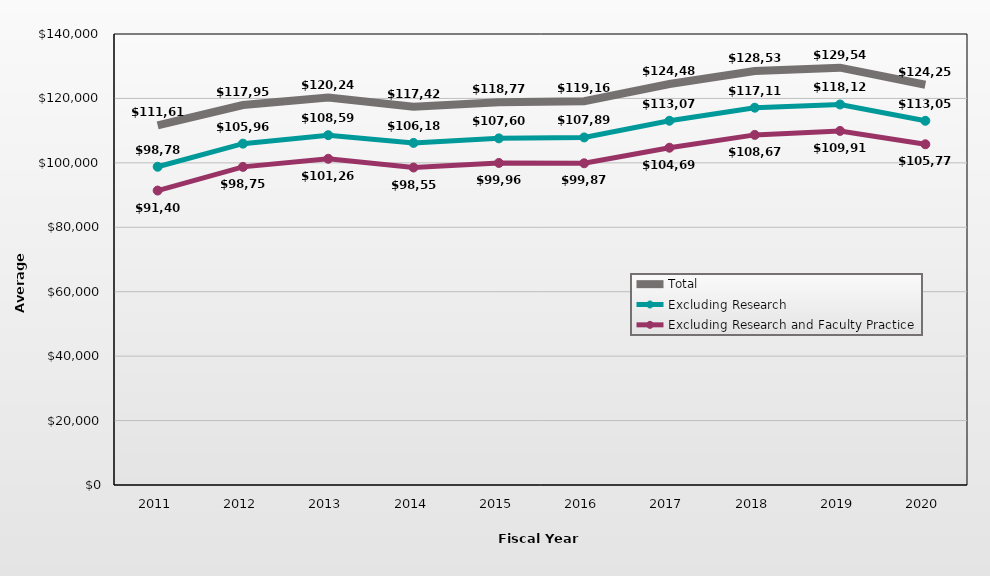
| Category | Total | Excluding Research | Excluding Research and Faculty Practice |
|---|---|---|---|
| 2011.0 | 111613 | 98786 | 91402 |
| 2012.0 | 117959 | 105962 | 98752 |
| 2013.0 | 120248 | 108596 | 101261 |
| 2014.0 | 117425 | 106187 | 98550 |
| 2015.0 | 118778 | 107606 | 99966 |
| 2016.0 | 119160 | 107892 | 99873 |
| 2017.0 | 124487 | 113070 | 104698 |
| 2018.0 | 128535 | 117119 | 108679 |
| 2019.0 | 129549 | 118124 | 109912 |
| 2020.0 | 124258 | 113054 | 105771 |